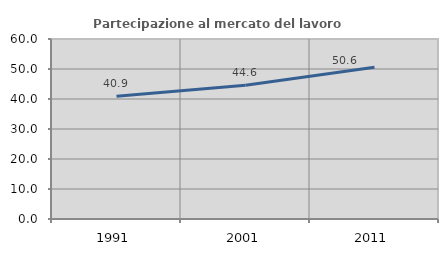
| Category | Partecipazione al mercato del lavoro  femminile |
|---|---|
| 1991.0 | 40.911 |
| 2001.0 | 44.584 |
| 2011.0 | 50.561 |